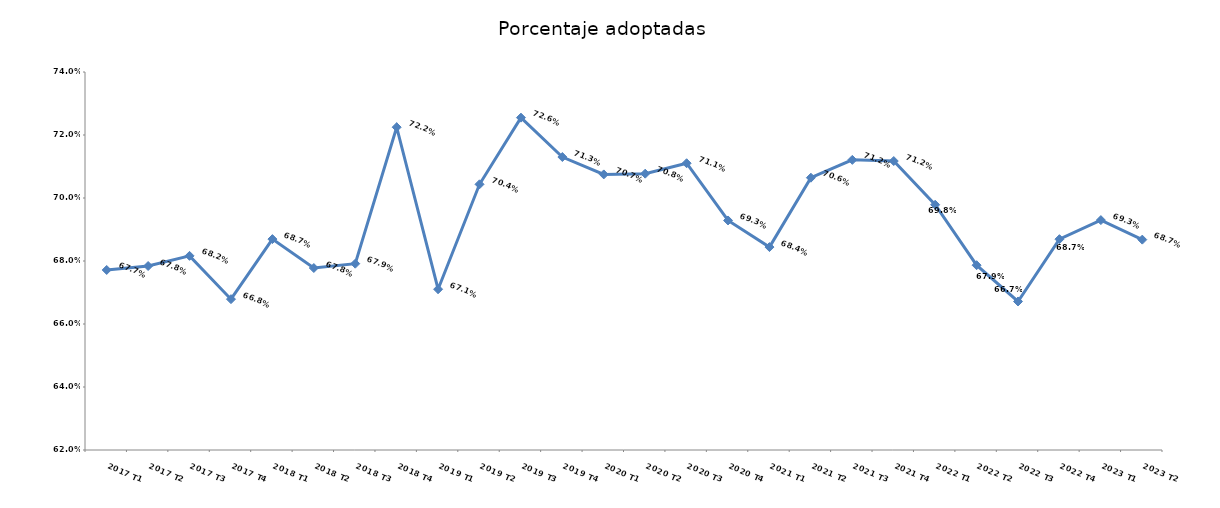
| Category | Porcentaje adoptadas |
|---|---|
| 2017 T1 | 0.677 |
| 2017 T2 | 0.678 |
| 2017 T3 | 0.682 |
| 2017 T4 | 0.668 |
| 2018 T1 | 0.687 |
| 2018 T2 | 0.678 |
| 2018 T3 | 0.679 |
| 2018 T4 | 0.722 |
| 2019 T1 | 0.671 |
| 2019 T2 | 0.704 |
| 2019 T3 | 0.726 |
| 2019 T4 | 0.713 |
| 2020 T1 | 0.707 |
| 2020 T2 | 0.708 |
| 2020 T3 | 0.711 |
| 2020 T4 | 0.693 |
| 2021 T1 | 0.684 |
| 2021 T2 | 0.706 |
| 2021 T3 | 0.712 |
| 2021 T4 | 0.712 |
| 2022 T1 | 0.698 |
| 2022 T2 | 0.679 |
| 2022 T3 | 0.667 |
| 2022 T4 | 0.687 |
| 2023 T1 | 0.693 |
| 2023 T2 | 0.687 |